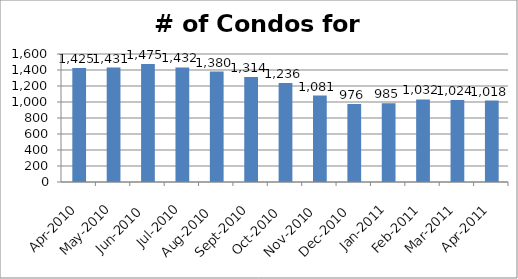
| Category | Series 0 |
|---|---|
| 2010-04-01 | 1425 |
| 2010-05-01 | 1431 |
| 2010-06-01 | 1475 |
| 2010-07-01 | 1432 |
| 2010-08-01 | 1380 |
| 2010-09-01 | 1314 |
| 2010-10-01 | 1236 |
| 2010-11-01 | 1081 |
| 2010-12-01 | 976 |
| 2011-01-01 | 985 |
| 2011-02-01 | 1032 |
| 2011-03-01 | 1024 |
| 2011-04-01 | 1018 |